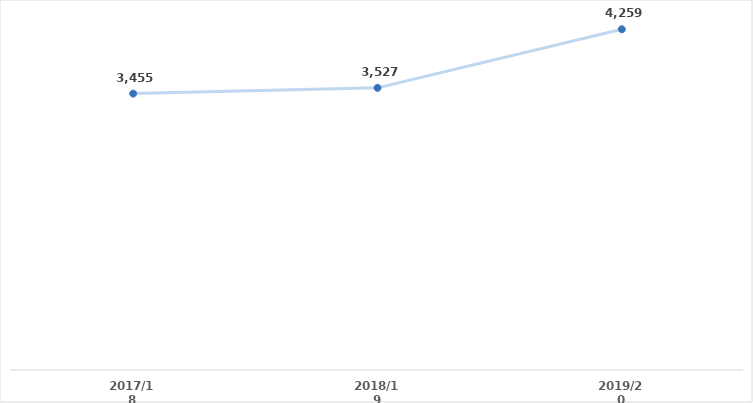
| Category | Series 0 |
|---|---|
| 2017/18 | 3455 |
| 2018/19 | 3527 |
| 2019/20 | 4259 |